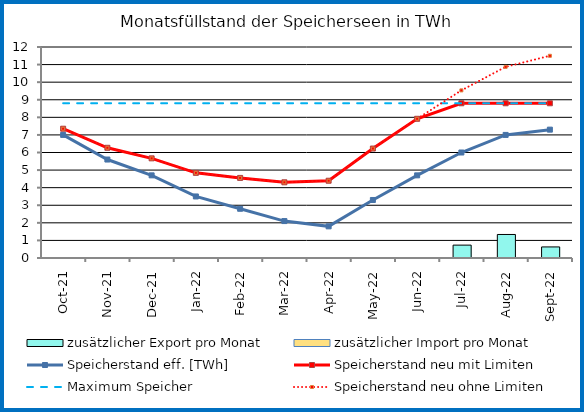
| Category | zusätzlicher Export pro Monat | zusätzlicher Import pro Monat |
|---|---|---|
| 0 | 0 | 0 |
| 1900-01-01 | 0 | 0 |
| 1900-01-02 | 0 | 0 |
| 1900-01-03 | 0 | 0 |
| 1900-01-04 | 0 | 0 |
| 1900-01-05 | 0 | 0 |
| 1900-01-06 | 0 | 0 |
| 1900-01-07 | 0 | 0 |
| 1900-01-08 | 0 | 0 |
| 1900-01-09 | 0.733 | 0 |
| 1900-01-10 | 1.338 | 0 |
| 1900-01-11 | 0.63 | 0 |